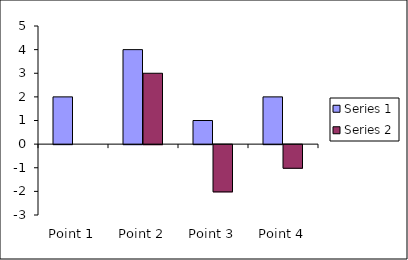
| Category | Series 1 | Series 2 |
|---|---|---|
| Point 1 | 2 | 0 |
| Point 2 | 4 | 3 |
| Point 3 | 1 | -2 |
| Point 4 | 2 | -1 |